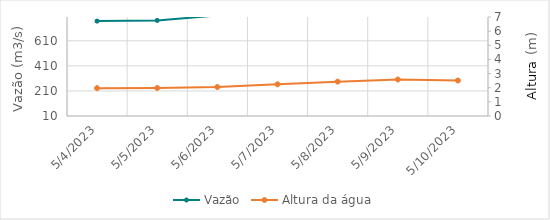
| Category | Vazão |
|---|---|
| 5/10/23 | 460.2 |
| 5/9/23 | 470.5 |
| 5/8/23 | 406.35 |
| 5/7/23 | 363.18 |
| 5/6/23 | 265.45 |
| 5/5/23 | 240.06 |
| 5/4/23 | 250.77 |